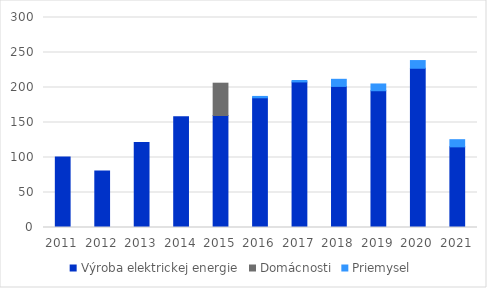
| Category | Výroba elektrickej energie | Domácnosti | Priemysel |
|---|---|---|---|
| 2011.0 | 100.57 | 0 | 0 |
| 2012.0 | 80.574 | 0 | 0 |
| 2013.0 | 121.32 | 0 | 0 |
| 2014.0 | 158.092 | 0 | 0 |
| 2015.0 | 160.031 | 46.127 | 0 |
| 2016.0 | 185.291 | 0 | 1.962 |
| 2017.0 | 207.941 | 0 | 2.056 |
| 2018.0 | 201.569 | 0 | 10.135 |
| 2019.0 | 195.385 | 0 | 9.665 |
| 2020.0 | 227.475 | 0 | 11.017 |
| 2021.0 | 115.221 | 0 | 10.234 |